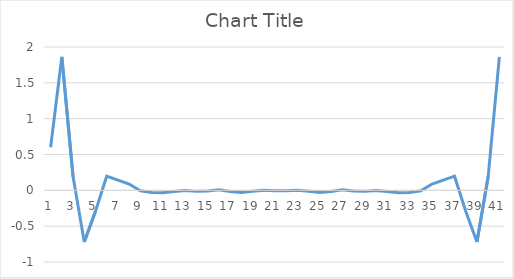
| Category | Series 0 |
|---|---|
| 0 | 0.601 |
| 1 | 1.863 |
| 2 | 0.191 |
| 3 | -0.722 |
| 4 | -0.293 |
| 5 | 0.197 |
| 6 | 0.142 |
| 7 | 0.088 |
| 8 | -0.007 |
| 9 | -0.03 |
| 10 | -0.032 |
| 11 | -0.015 |
| 12 | -0.003 |
| 13 | -0.015 |
| 14 | -0.009 |
| 15 | 0.01 |
| 16 | -0.016 |
| 17 | -0.029 |
| 18 | -0.014 |
| 19 | 0 |
| 20 | -0.005 |
| 21 | -0.005 |
| 22 | 0 |
| 23 | -0.014 |
| 24 | -0.029 |
| 25 | -0.016 |
| 26 | 0.01 |
| 27 | -0.009 |
| 28 | -0.015 |
| 29 | -0.003 |
| 30 | -0.015 |
| 31 | -0.032 |
| 32 | -0.03 |
| 33 | -0.007 |
| 34 | 0.088 |
| 35 | 0.142 |
| 36 | 0.197 |
| 37 | -0.293 |
| 38 | -0.722 |
| 39 | 0.191 |
| 40 | 1.863 |